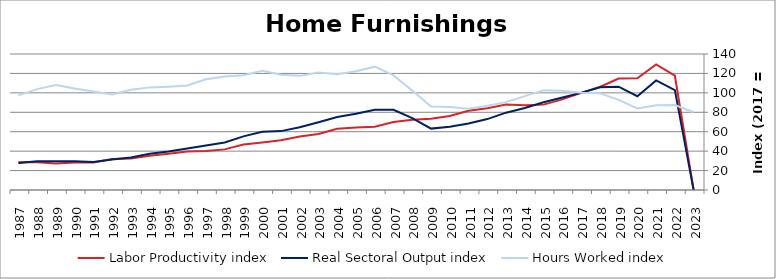
| Category | Labor Productivity index | Real Sectoral Output index | Hours Worked index |
|---|---|---|---|
| 2023.0 | 0 | 0 | 80.071 |
| 2022.0 | 117.631 | 102.827 | 87.415 |
| 2021.0 | 129.353 | 112.825 | 87.223 |
| 2020.0 | 115.104 | 96.575 | 83.902 |
| 2019.0 | 114.698 | 106.39 | 92.756 |
| 2018.0 | 106.042 | 105.733 | 99.709 |
| 2017.0 | 100 | 100 | 100 |
| 2016.0 | 93.255 | 95.166 | 102.05 |
| 2015.0 | 87.883 | 90.278 | 102.726 |
| 2014.0 | 87.283 | 84.349 | 96.639 |
| 2013.0 | 88.014 | 79.606 | 90.447 |
| 2012.0 | 84.178 | 73.014 | 86.737 |
| 2011.0 | 81.632 | 68.357 | 83.738 |
| 2010.0 | 76.157 | 65.015 | 85.369 |
| 2009.0 | 73.454 | 63.197 | 86.036 |
| 2008.0 | 72.213 | 74.028 | 102.512 |
| 2007.0 | 69.983 | 82.511 | 117.902 |
| 2006.0 | 65.106 | 82.653 | 126.952 |
| 2005.0 | 64.28 | 78.544 | 122.191 |
| 2004.0 | 63.095 | 75.213 | 119.207 |
| 2003.0 | 57.686 | 69.77 | 120.946 |
| 2002.0 | 55.032 | 64.655 | 117.487 |
| 2001.0 | 51.121 | 60.611 | 118.564 |
| 2000.0 | 48.833 | 59.993 | 122.853 |
| 1999.0 | 46.749 | 55.221 | 118.123 |
| 1998.0 | 41.81 | 48.883 | 116.917 |
| 1997.0 | 40.142 | 45.768 | 114.015 |
| 1996.0 | 39.628 | 42.614 | 107.535 |
| 1995.0 | 37.257 | 39.642 | 106.401 |
| 1994.0 | 35.316 | 37.308 | 105.638 |
| 1993.0 | 32.356 | 33.38 | 103.166 |
| 1992.0 | 31.822 | 31.289 | 98.323 |
| 1991.0 | 28.33 | 28.71 | 101.342 |
| 1990.0 | 28.335 | 29.595 | 104.445 |
| 1989.0 | 27.244 | 29.473 | 108.182 |
| 1988.0 | 28.555 | 29.661 | 103.874 |
| 1987.0 | 28.534 | 27.793 | 97.403 |